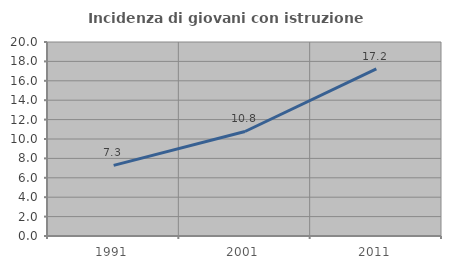
| Category | Incidenza di giovani con istruzione universitaria |
|---|---|
| 1991.0 | 7.277 |
| 2001.0 | 10.775 |
| 2011.0 | 17.231 |